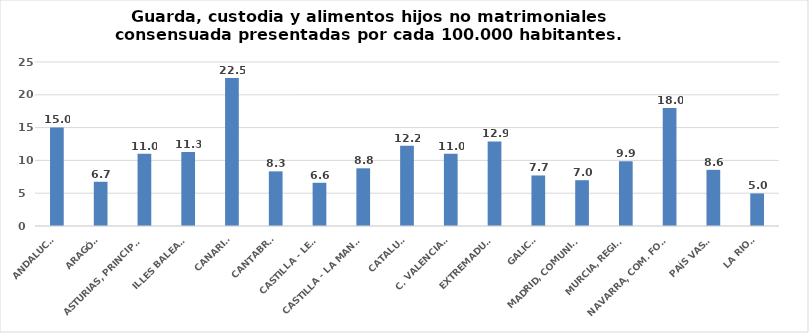
| Category | Series 0 |
|---|---|
| ANDALUCÍA | 15.025 |
| ARAGÓN | 6.744 |
| ASTURIAS, PRINCIPADO | 11.027 |
| ILLES BALEARS | 11.27 |
| CANARIAS | 22.55 |
| CANTABRIA | 8.326 |
| CASTILLA - LEÓN | 6.59 |
| CASTILLA - LA MANCHA | 8.795 |
| CATALUÑA | 12.229 |
| C. VALENCIANA | 11 |
| EXTREMADURA | 12.899 |
| GALICIA | 7.705 |
| MADRID, COMUNIDAD | 6.979 |
| MURCIA, REGIÓN | 9.854 |
| NAVARRA, COM. FORAL | 18.001 |
| PAÍS VASCO | 8.559 |
| LA RIOJA | 4.965 |